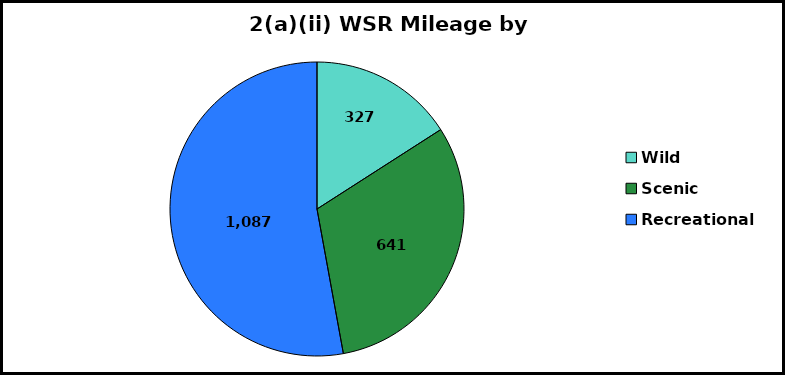
| Category | Series 0 |
|---|---|
| 0 | 327.1 |
| 1 | 641.3 |
| 2 | 1086.5 |